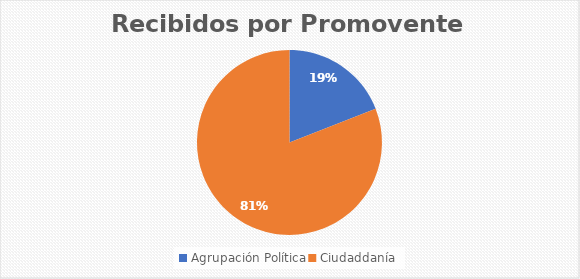
| Category | Series 0 |
|---|---|
| Agrupación Política | 8 |
| Ciudaddanía | 34 |